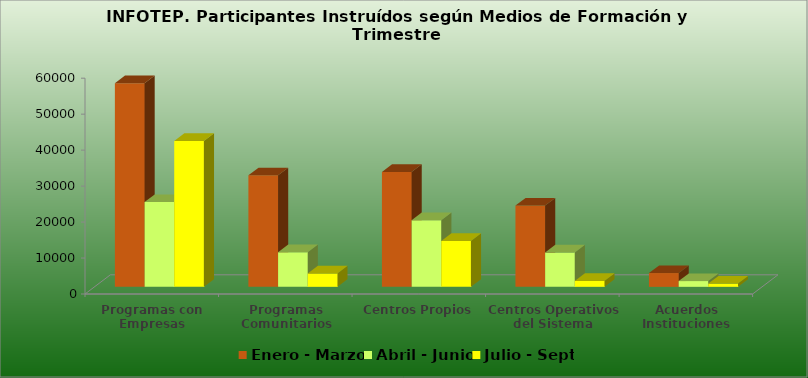
| Category | Enero - Marzo | Abril - Junio | Julio - Sept |
|---|---|---|---|
| Programas con Empresas | 56626 | 23566 | 40540 |
| Programas Comunitarios | 30999 | 9619 | 3723 |
| Centros Propios | 31945 | 18502 | 12748 |
| Centros Operativos del Sistema | 22599 | 9571 | 1641 |
| Acuerdos Instituciones | 3832 | 1603 | 904 |